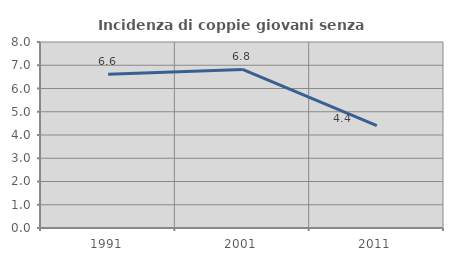
| Category | Incidenza di coppie giovani senza figli |
|---|---|
| 1991.0 | 6.612 |
| 2001.0 | 6.82 |
| 2011.0 | 4.399 |